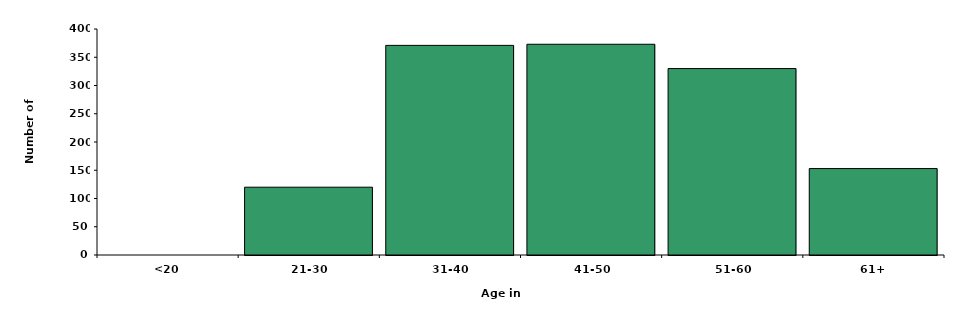
| Category | Series 0 |
|---|---|
| <20 | 0 |
| 21-30 | 120 |
| 31-40 | 371 |
| 41-50 | 373 |
| 51-60 | 330 |
| 61+ | 153 |